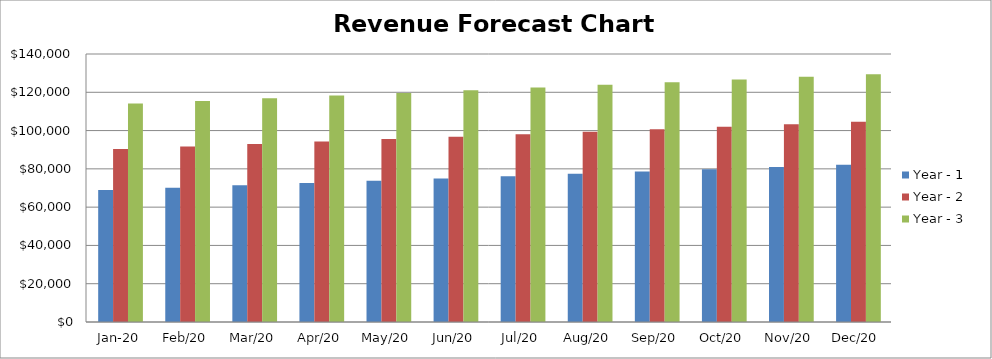
| Category | Year - 1 | Year - 2 | Year - 3 |
|---|---|---|---|
| 2020-01-01 | 68988.5 | 90336.1 | 114083.7 |
| 2020-02-01 | 70188.3 | 91635.9 | 115483.5 |
| 2020-03-01 | 71388.1 | 92935.7 | 116883.3 |
| 2020-04-01 | 72587.9 | 94235.5 | 118283.1 |
| 2020-05-01 | 73787.7 | 95535.3 | 119682.9 |
| 2020-06-01 | 74987.5 | 96835.1 | 121082.7 |
| 2020-07-01 | 76187.3 | 98134.9 | 122482.5 |
| 2020-08-01 | 77387.1 | 99434.7 | 123882.3 |
| 2020-09-01 | 78586.9 | 100734.5 | 125282.1 |
| 2020-10-01 | 79786.7 | 102034.3 | 126681.9 |
| 2020-11-01 | 80986.5 | 103334.1 | 128081.7 |
| 2020-12-01 | 82186.3 | 104633.9 | 129481.5 |